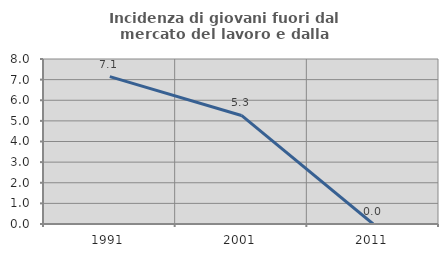
| Category | Incidenza di giovani fuori dal mercato del lavoro e dalla formazione  |
|---|---|
| 1991.0 | 7.143 |
| 2001.0 | 5.263 |
| 2011.0 | 0 |